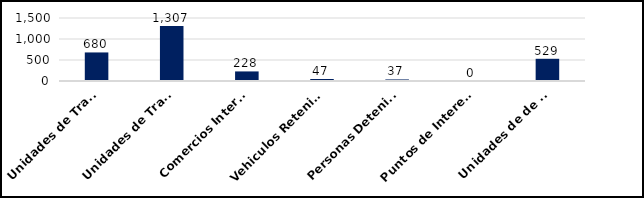
| Category | Series 0 |
|---|---|
| Unidades de Transporte de Combustibles Inspeccionados | 680 |
| Unidades de Transporte de Mercancias Inspeccionadas | 1307 |
| Comercios Intervenidos | 228 |
| Vehiculos Retenidos  | 47 |
| Personas Detenidas | 37 |
| Puntos de Interes intervenidos | 0 |
| Unidades de de Transporte Desechos Oleosos Inspeccionadas  | 529 |